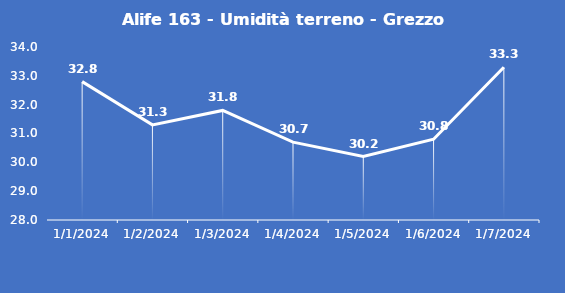
| Category | Alife 163 - Umidità terreno - Grezzo (%VWC) |
|---|---|
| 1/1/24 | 32.8 |
| 1/2/24 | 31.3 |
| 1/3/24 | 31.8 |
| 1/4/24 | 30.7 |
| 1/5/24 | 30.2 |
| 1/6/24 | 30.8 |
| 1/7/24 | 33.3 |